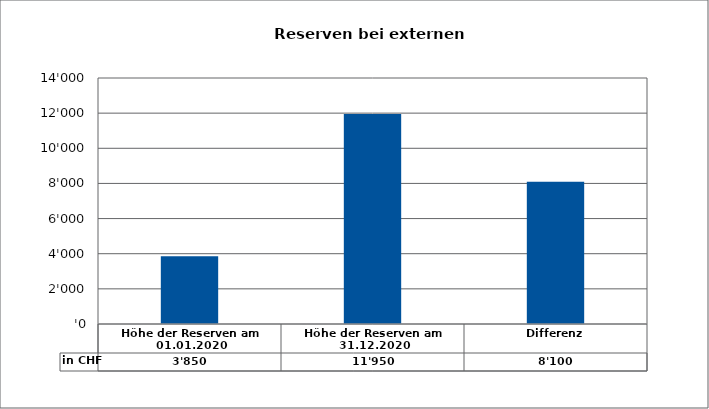
| Category | in CHF |
|---|---|
| Höhe der Reserven am 01.01.2020 | 3850 |
| Höhe der Reserven am 31.12.2020 | 11950 |
| Differenz | 8100 |